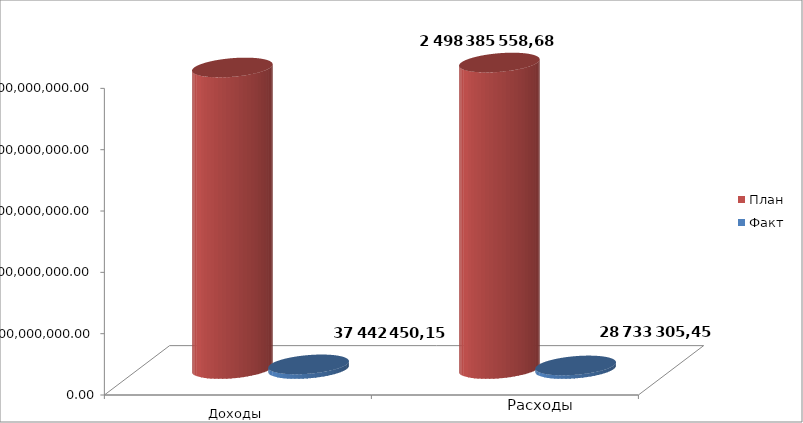
| Category | План | Факт |
|---|---|---|
| 0 | 2458095730.68 | 37442450.15 |
| 1 | 2498385558.68 | 28733305.45 |